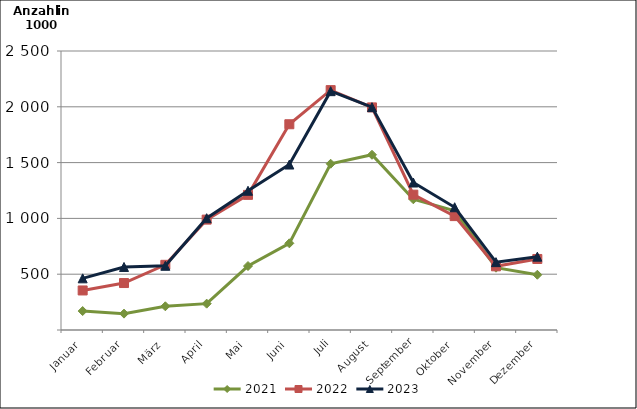
| Category | 2021 | 2022 | 2023 |
|---|---|---|---|
| Januar | 169.711 | 354.337 | 462.891 |
| Februar | 146.648 | 420.848 | 564.881 |
| März | 212.513 | 584.044 | 575.328 |
| April | 236.046 | 989.083 | 1001.711 |
| Mai | 573.212 | 1210.892 | 1247.513 |
| Juni | 776.698 | 1843.586 | 1482.616 |
| Juli | 1489.747 | 2149.456 | 2140.164 |
| August | 1570.263 | 1994.619 | 1997.014 |
| September | 1171.287 | 1212.49 | 1321.461 |
| Oktober | 1068.022 | 1020.576 | 1099.802 |
| November | 558.324 | 570.6 | 608.176 |
| Dezember | 495.1 | 636.437 | 657.189 |